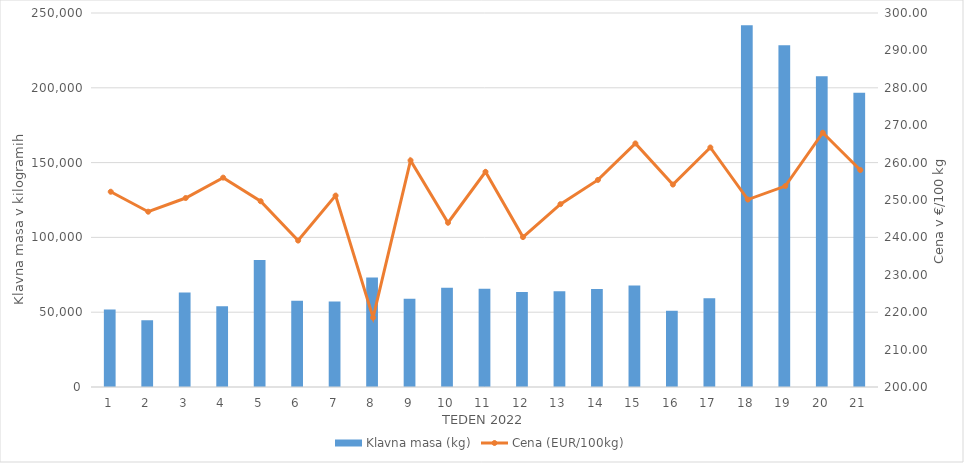
| Category | Klavna masa (kg) |
|---|---|
| 1.0 | 51818 |
| 2.0 | 44619 |
| 3.0 | 63233 |
| 4.0 | 53993 |
| 5.0 | 84871 |
| 6.0 | 57648 |
| 7.0 | 57159 |
| 8.0 | 73139 |
| 9.0 | 59056 |
| 10.0 | 66417 |
| 11.0 | 65723 |
| 12.0 | 63530 |
| 13.0 | 64069 |
| 14.0 | 65564 |
| 15.0 | 67787 |
| 16.0 | 50958 |
| 17.0 | 59387 |
| 18.0 | 241833 |
| 19.0 | 228389 |
| 20.0 | 207661 |
| 21.0 | 196732 |